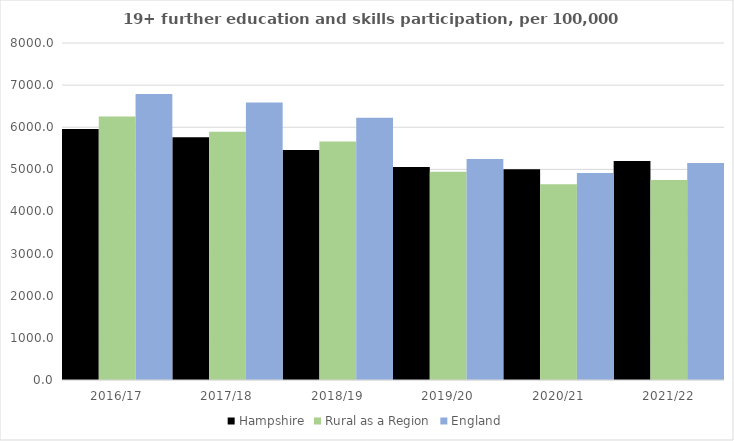
| Category | Hampshire | Rural as a Region | England |
|---|---|---|---|
| 2016/17 | 5958.665 | 6253.401 | 6788 |
| 2017/18 | 5763.029 | 5892.029 | 6588 |
| 2018/19 | 5458.455 | 5661.873 | 6227 |
| 2019/20 | 5054.292 | 4943.801 | 5244 |
| 2020/21 | 5004.81 | 4646.727 | 4913 |
| 2021/22 | 5201.224 | 4747.049 | 5151 |